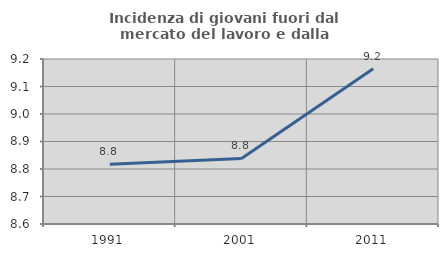
| Category | Incidenza di giovani fuori dal mercato del lavoro e dalla formazione  |
|---|---|
| 1991.0 | 8.818 |
| 2001.0 | 8.838 |
| 2011.0 | 9.164 |